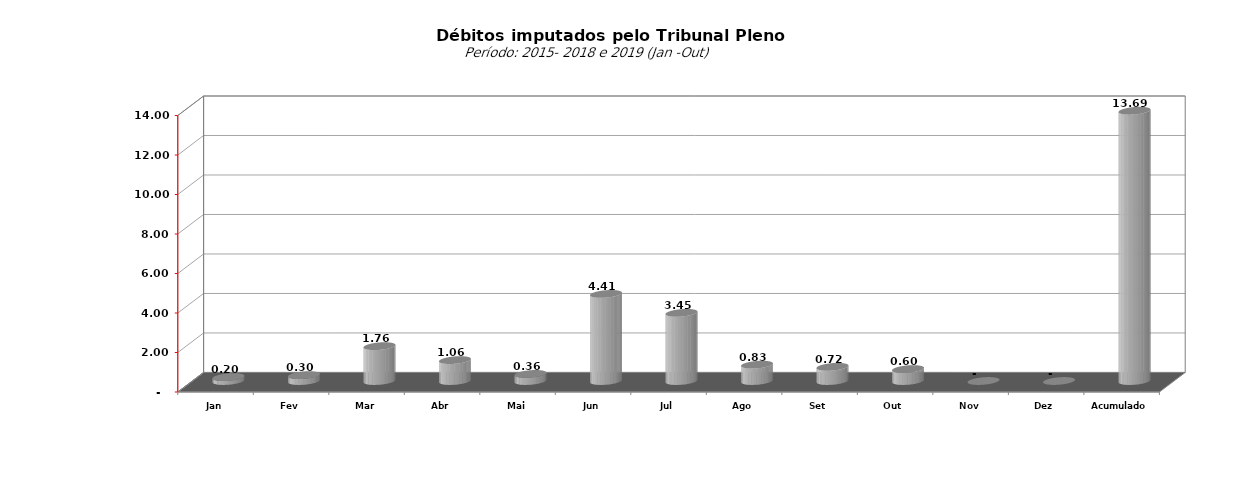
| Category |  7.073.154,74   5.749.129,25   4.727.033,51   16.081.820,48   21.535.723,60   8.578.266,09   25.676.499,17   10.592.915,18   197.255,77   296.375,09   1.764.671,00   1.058.511,33   358.973,08   4.409.150,19   3.450.817,21   826.867,37   718.665,59   604.8 |
|---|---|
| Jan | 197255.77 |
| Fev | 296375.09 |
| Mar | 1764671 |
| Abr | 1058511.33 |
| Mai | 358973.08 |
| Jun | 4409150.19 |
| Jul | 3450817.21 |
| Ago | 826867.37 |
| Set | 718665.59 |
| Out | 604869.83 |
| Nov | 0 |
| Dez | 0 |
| Acumulado | 13686156.46 |